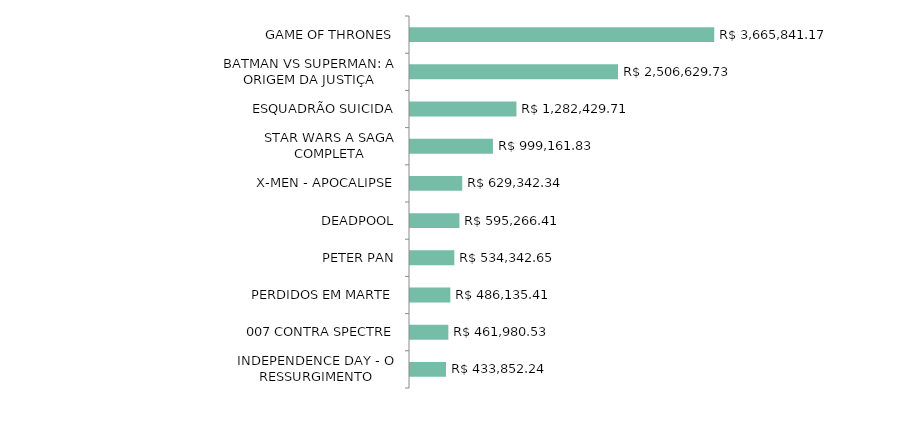
| Category | Series 0 |
|---|---|
| GAME OF THRONES | 3665841.17 |
| BATMAN VS SUPERMAN: A ORIGEM DA JUSTIÇA | 2506629.73 |
| ESQUADRÃO SUICIDA | 1282429.71 |
| STAR WARS A SAGA COMPLETA | 999161.83 |
| X-MEN - APOCALIPSE | 629342.34 |
| DEADPOOL | 595266.41 |
| PETER PAN | 534342.65 |
| PERDIDOS EM MARTE | 486135.41 |
| 007 CONTRA SPECTRE | 461980.53 |
| INDEPENDENCE DAY - O RESSURGIMENTO | 433852.24 |